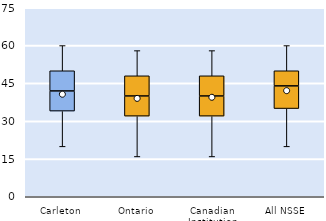
| Category | 25th | 50th | 75th |
|---|---|---|---|
| Carleton | 34 | 8 | 8 |
| Ontario | 32 | 8 | 8 |
| Canadian Institution | 32 | 8 | 8 |
| All NSSE | 35 | 9 | 6 |